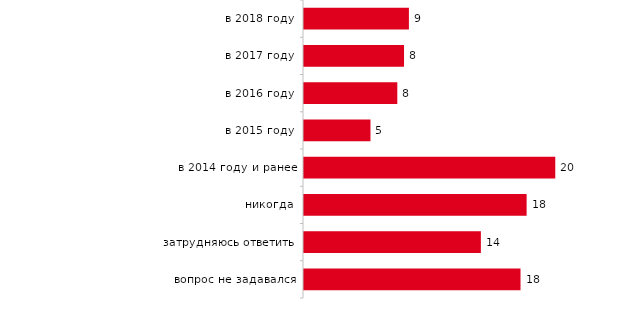
| Category | Series 0 |
|---|---|
| в 2018 году | 8.515 |
| в 2017 году | 8.119 |
| в 2016 году | 7.574 |
| в 2015 году | 5.396 |
| в 2014 году и ранее | 20.396 |
| никогда | 18.069 |
| затрудняюсь ответить | 14.356 |
| вопрос не задавался | 17.574 |